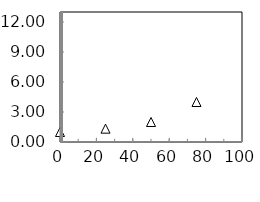
| Category | Series 2 |
|---|---|
| 0.0 | 1 |
| 25.0 | 1.333 |
| 50.0 | 2 |
| 75.0 | 4 |